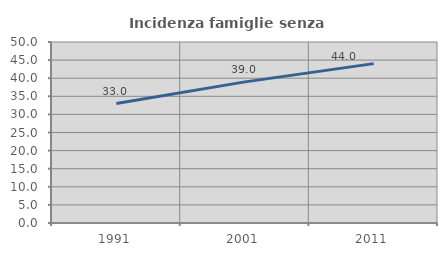
| Category | Incidenza famiglie senza nuclei |
|---|---|
| 1991.0 | 33 |
| 2001.0 | 38.983 |
| 2011.0 | 44.025 |